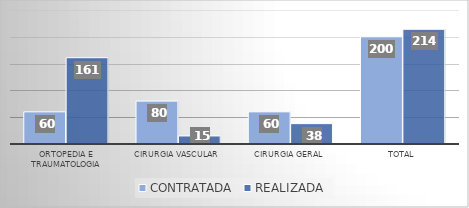
| Category | CONTRATADA | REALIZADA |
|---|---|---|
| Ortopedia e traumatologia | 60 | 161 |
| Cirurgia vascular | 80 | 15 |
| Cirurgia Geral | 60 | 38 |
| TOTAL | 200 | 214 |